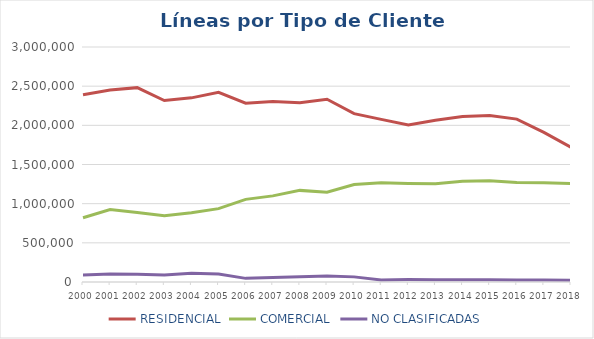
| Category | RESIDENCIAL | COMERCIAL | NO CLASIFICADAS |
|---|---|---|---|
| 2000.0 | 2391600.86 | 820134.14 | 90763 |
| 2001.0 | 2450631.958 | 924449.042 | 103411 |
| 2002.0 | 2481214 | 887657 | 98142 |
| 2003.0 | 2315980 | 846524 | 89559 |
| 2004.0 | 2350770.912 | 882812.088 | 111519 |
| 2005.0 | 2420710.597 | 936558.403 | 103376 |
| 2006.0 | 2282170 | 1055019 | 46408 |
| 2007.0 | 2304237 | 1099345 | 56029 |
| 2008.0 | 2289075 | 1169557 | 66158 |
| 2009.0 | 2332952 | 1145936 | 76423 |
| 2010.0 | 2149852 | 1244093 | 65422 |
| 2011.0 | 2076184 | 1267963 | 25957 |
| 2012.0 | 2003235 | 1257853 | 31414 |
| 2013.0 | 2064536 | 1252954 | 29741 |
| 2014.0 | 2113422 | 1284776 | 29551 |
| 2015.0 | 2126562 | 1291291 | 28027 |
| 2016.0 | 2079358 | 1270087 | 25592 |
| 2017.0 | 1909980 | 1265880 | 24385 |
| 2018.0 | 1718412 | 1256588 | 22192 |